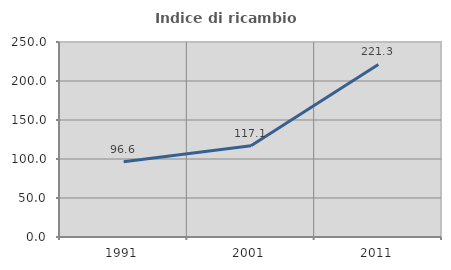
| Category | Indice di ricambio occupazionale  |
|---|---|
| 1991.0 | 96.599 |
| 2001.0 | 117.105 |
| 2011.0 | 221.277 |